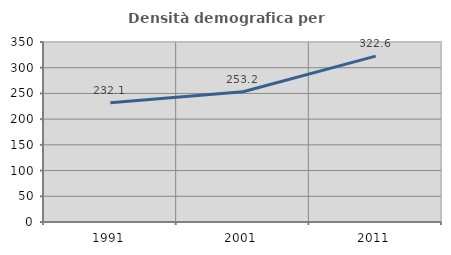
| Category | Densità demografica |
|---|---|
| 1991.0 | 232.063 |
| 2001.0 | 253.159 |
| 2011.0 | 322.594 |